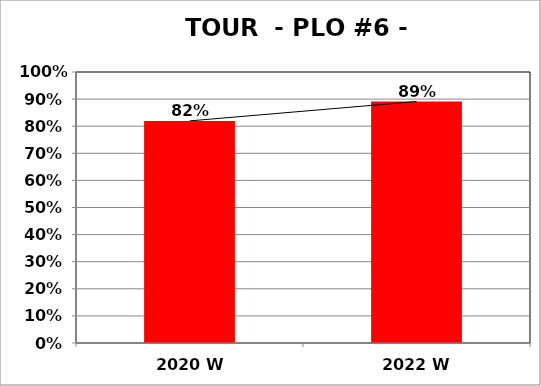
| Category | Series 0 |
|---|---|
| 2020 W | 0.82 |
| 2022 W | 0.891 |